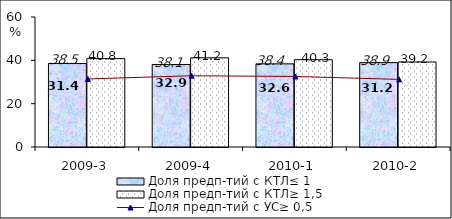
| Category | Доля предп-тий с КТЛ≤ 1 | Доля предп-тий с КТЛ≥ 1,5 |
|---|---|---|
| 2009-3 | 38.52 | 40.79 |
| 2009-4 | 38.06 | 41.17 |
| 2010-1 | 38.37 | 40.29 |
| 2010-2 | 38.94 | 39.24 |